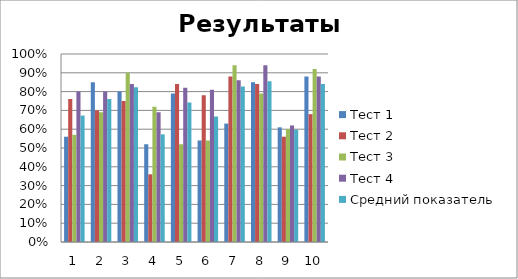
| Category | Тест 1 | Тест 2  | Тест 3 | Тест 4  | Средний показатель  |
|---|---|---|---|---|---|
| 0 | 0.56 | 0.76 | 0.57 | 0.8 | 0.673 |
| 1 | 0.85 | 0.7 | 0.69 | 0.8 | 0.76 |
| 2 | 0.8 | 0.75 | 0.9 | 0.84 | 0.822 |
| 3 | 0.52 | 0.36 | 0.72 | 0.69 | 0.572 |
| 4 | 0.79 | 0.84 | 0.52 | 0.82 | 0.742 |
| 5 | 0.54 | 0.78 | 0.54 | 0.81 | 0.668 |
| 6 | 0.63 | 0.88 | 0.94 | 0.86 | 0.828 |
| 7 | 0.85 | 0.84 | 0.79 | 0.94 | 0.855 |
| 8 | 0.61 | 0.56 | 0.6 | 0.62 | 0.598 |
| 9 | 0.88 | 0.68 | 0.92 | 0.88 | 0.84 |